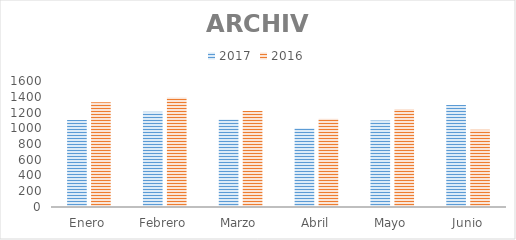
| Category | 2017 | 2016 |
|---|---|---|
| Enero | 1104 | 1331 |
| Febrero | 1208 | 1389 |
| Marzo | 1111 | 1219 |
| Abril | 999 | 1122 |
| Mayo | 1098 | 1246 |
| Junio | 1294 | 981 |